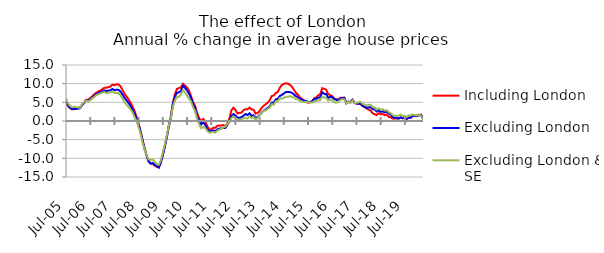
| Category | Including London | Excluding London | Excluding London & SE |
|---|---|---|---|
| 2005-07-01 | 5.042 | 5.34 | 6.041 |
| 2005-08-01 | 4.021 | 4.233 | 4.729 |
| 2005-09-01 | 3.44 | 3.609 | 4.031 |
| 2005-10-01 | 3.117 | 3.198 | 3.683 |
| 2005-11-01 | 3.119 | 3.179 | 3.804 |
| 2005-12-01 | 3.391 | 3.293 | 3.72 |
| 2006-01-01 | 3.46 | 3.314 | 3.632 |
| 2006-02-01 | 3.679 | 3.428 | 3.573 |
| 2006-03-01 | 4.36 | 4.288 | 4.578 |
| 2006-04-01 | 4.971 | 4.807 | 4.982 |
| 2006-05-01 | 5.703 | 5.549 | 5.472 |
| 2006-06-01 | 5.682 | 5.378 | 5.289 |
| 2006-07-01 | 6.13 | 5.818 | 5.553 |
| 2006-08-01 | 6.584 | 6.212 | 6.08 |
| 2006-09-01 | 7.141 | 6.725 | 6.422 |
| 2006-10-01 | 7.569 | 7.227 | 6.924 |
| 2006-11-01 | 7.9 | 7.477 | 7.14 |
| 2006-12-01 | 8.141 | 7.684 | 7.41 |
| 2007-01-01 | 8.527 | 7.906 | 7.62 |
| 2007-02-01 | 8.881 | 8.173 | 7.77 |
| 2007-03-01 | 8.911 | 8.019 | 7.457 |
| 2007-04-01 | 9.095 | 8.169 | 7.568 |
| 2007-05-01 | 9.213 | 8.204 | 7.716 |
| 2007-06-01 | 9.739 | 8.578 | 7.871 |
| 2007-07-01 | 9.603 | 8.264 | 7.598 |
| 2007-08-01 | 9.834 | 8.384 | 7.471 |
| 2007-09-01 | 9.759 | 8.353 | 7.476 |
| 2007-10-01 | 9.31 | 7.908 | 6.946 |
| 2007-11-01 | 8.338 | 7.116 | 6.089 |
| 2007-12-01 | 7.301 | 6.209 | 5.13 |
| 2008-01-01 | 6.594 | 5.569 | 4.358 |
| 2008-02-01 | 5.803 | 4.819 | 3.807 |
| 2008-03-01 | 4.897 | 4.031 | 3.135 |
| 2008-04-01 | 3.869 | 3.081 | 2.34 |
| 2008-05-01 | 2.669 | 1.982 | 1.042 |
| 2008-06-01 | 1.104 | 0.608 | -0.088 |
| 2008-07-01 | -0.68 | -0.992 | -1.674 |
| 2008-08-01 | -2.784 | -3 | -3.489 |
| 2008-09-01 | -5.142 | -5.294 | -5.824 |
| 2008-10-01 | -7.4 | -7.555 | -7.844 |
| 2008-11-01 | -9.283 | -9.376 | -9.246 |
| 2008-12-01 | -10.716 | -10.891 | -10.295 |
| 2009-01-01 | -11.416 | -11.431 | -10.399 |
| 2009-02-01 | -11.461 | -11.235 | -10.34 |
| 2009-03-01 | -11.986 | -11.748 | -10.864 |
| 2009-04-01 | -12.284 | -12.069 | -11.542 |
| 2009-05-01 | -12.391 | -12.497 | -11.751 |
| 2009-06-01 | -11.045 | -11.133 | -10.506 |
| 2009-07-01 | -9.035 | -9.204 | -8.454 |
| 2009-08-01 | -6.756 | -6.883 | -6.256 |
| 2009-09-01 | -3.959 | -4.358 | -3.813 |
| 2009-10-01 | -1.05 | -1.44 | -1.209 |
| 2009-11-01 | 1.332 | 0.762 | 0.706 |
| 2009-12-01 | 4.938 | 4.524 | 3.867 |
| 2010-01-01 | 7.185 | 6.538 | 5.474 |
| 2010-02-01 | 8.595 | 7.568 | 6.419 |
| 2010-03-01 | 8.825 | 7.698 | 6.489 |
| 2010-04-01 | 9.037 | 8.044 | 7.15 |
| 2010-05-01 | 9.954 | 9.479 | 8.277 |
| 2010-06-01 | 9.51 | 8.83 | 7.67 |
| 2010-07-01 | 8.98 | 8.233 | 6.814 |
| 2010-08-01 | 8.1 | 7.247 | 5.995 |
| 2010-09-01 | 6.68 | 6.17 | 5.224 |
| 2010-10-01 | 5.06 | 4.477 | 3.72 |
| 2010-11-01 | 4.111 | 3.455 | 2.686 |
| 2010-12-01 | 2.111 | 1.245 | 0.589 |
| 2011-01-01 | 0.812 | 0.009 | -0.813 |
| 2011-02-01 | -0.153 | -0.975 | -1.959 |
| 2011-03-01 | 0.561 | -0.352 | -1.604 |
| 2011-04-01 | -0.049 | -0.993 | -1.861 |
| 2011-05-01 | -1.337 | -2.104 | -2.603 |
| 2011-06-01 | -2.364 | -2.804 | -3.111 |
| 2011-07-01 | -2.193 | -2.71 | -3.015 |
| 2011-08-01 | -1.838 | -2.514 | -2.939 |
| 2011-09-01 | -1.815 | -2.702 | -3.127 |
| 2011-10-01 | -1.313 | -2.26 | -2.601 |
| 2011-11-01 | -1.193 | -2.051 | -2.33 |
| 2011-12-01 | -1.187 | -1.975 | -2.083 |
| 2012-01-01 | -1.1 | -1.808 | -1.74 |
| 2012-02-01 | -1.426 | -1.872 | -1.49 |
| 2012-03-01 | -0.66 | -1.074 | -0.763 |
| 2012-04-01 | 0.645 | -0.139 | -0.379 |
| 2012-05-01 | 2.851 | 1.385 | 0.785 |
| 2012-06-01 | 3.556 | 1.855 | 1.213 |
| 2012-07-01 | 2.98 | 1.48 | 0.842 |
| 2012-08-01 | 2.051 | 0.876 | 0.424 |
| 2012-09-01 | 2.183 | 0.85 | 0.325 |
| 2012-10-01 | 2.249 | 1.007 | 0.526 |
| 2012-11-01 | 2.896 | 1.405 | 0.672 |
| 2012-12-01 | 3.177 | 1.864 | 0.816 |
| 2013-01-01 | 3.149 | 1.614 | 0.648 |
| 2013-02-01 | 3.602 | 2.058 | 1.223 |
| 2013-03-01 | 3.097 | 1.383 | 0.768 |
| 2013-04-01 | 3.012 | 1.539 | 1.119 |
| 2013-05-01 | 1.998 | 0.817 | 0.37 |
| 2013-06-01 | 2.165 | 1.096 | 0.849 |
| 2013-07-01 | 2.664 | 1.622 | 1.488 |
| 2013-08-01 | 3.537 | 2.231 | 2.192 |
| 2013-09-01 | 4.062 | 2.809 | 2.824 |
| 2013-10-01 | 4.504 | 3.05 | 2.769 |
| 2013-11-01 | 4.904 | 3.489 | 3.256 |
| 2013-12-01 | 5.552 | 3.894 | 3.532 |
| 2014-01-01 | 6.672 | 4.881 | 4.507 |
| 2014-02-01 | 6.837 | 4.965 | 4.315 |
| 2014-03-01 | 7.485 | 5.784 | 5.271 |
| 2014-04-01 | 7.762 | 5.942 | 5.327 |
| 2014-05-01 | 8.89 | 6.699 | 6.153 |
| 2014-06-01 | 9.637 | 6.984 | 5.954 |
| 2014-07-01 | 9.951 | 7.361 | 6.199 |
| 2014-08-01 | 10.096 | 7.756 | 6.47 |
| 2014-09-01 | 10.007 | 7.805 | 6.464 |
| 2014-10-01 | 9.695 | 7.747 | 6.671 |
| 2014-11-01 | 9.213 | 7.531 | 6.418 |
| 2014-12-01 | 8.373 | 7.095 | 6.34 |
| 2015-01-01 | 7.547 | 6.647 | 5.856 |
| 2015-02-01 | 7.027 | 6.342 | 5.823 |
| 2015-03-01 | 6.305 | 5.908 | 5.404 |
| 2015-04-01 | 5.966 | 5.669 | 5.238 |
| 2015-05-01 | 5.412 | 5.482 | 5.073 |
| 2015-06-01 | 5.095 | 5.374 | 5.149 |
| 2015-07-01 | 4.873 | 5.112 | 5.019 |
| 2015-08-01 | 5.068 | 5.03 | 4.93 |
| 2015-09-01 | 5.314 | 5.251 | 4.922 |
| 2015-10-01 | 6.053 | 5.827 | 5.238 |
| 2015-11-01 | 6.264 | 5.939 | 5.358 |
| 2015-12-01 | 6.887 | 6.247 | 5.55 |
| 2016-01-01 | 7.107 | 6.314 | 5.615 |
| 2016-02-01 | 8.779 | 7.698 | 6.563 |
| 2016-03-01 | 8.635 | 7.291 | 6.253 |
| 2016-04-01 | 8.371 | 7.184 | 6.224 |
| 2016-05-01 | 7.156 | 6.181 | 5.489 |
| 2016-06-01 | 6.972 | 6.52 | 5.778 |
| 2016-07-01 | 6.659 | 6.355 | 5.535 |
| 2016-08-01 | 5.976 | 5.937 | 5.005 |
| 2016-09-01 | 5.835 | 5.644 | 4.902 |
| 2016-10-01 | 5.753 | 5.566 | 5.12 |
| 2016-11-01 | 6.201 | 5.946 | 5.677 |
| 2016-12-01 | 6.209 | 6.09 | 5.808 |
| 2017-01-01 | 6.212 | 6.218 | 5.846 |
| 2017-02-01 | 4.709 | 4.856 | 4.729 |
| 2017-03-01 | 5.087 | 5.218 | 5.135 |
| 2017-04-01 | 5.037 | 4.991 | 4.884 |
| 2017-05-01 | 5.713 | 5.63 | 5.481 |
| 2017-06-01 | 4.922 | 4.802 | 4.805 |
| 2017-07-01 | 4.694 | 4.681 | 4.875 |
| 2017-08-01 | 4.548 | 4.66 | 4.997 |
| 2017-09-01 | 4.546 | 4.661 | 5.149 |
| 2017-10-01 | 4.045 | 4.097 | 4.617 |
| 2017-11-01 | 3.801 | 3.778 | 4.397 |
| 2017-12-01 | 3.345 | 3.572 | 4.193 |
| 2018-01-01 | 3.076 | 3.616 | 4.283 |
| 2018-02-01 | 2.85 | 3.709 | 4.383 |
| 2018-03-01 | 2.045 | 3.175 | 3.754 |
| 2018-04-01 | 1.853 | 3.127 | 3.645 |
| 2018-05-01 | 1.563 | 2.563 | 3.05 |
| 2018-06-01 | 2.107 | 2.876 | 3.381 |
| 2018-07-01 | 1.779 | 2.45 | 3.027 |
| 2018-08-01 | 1.905 | 2.582 | 3.154 |
| 2018-09-01 | 1.567 | 2.333 | 2.802 |
| 2018-10-01 | 1.769 | 2.521 | 2.902 |
| 2018-11-01 | 1.108 | 2.039 | 2.339 |
| 2018-12-01 | 0.984 | 1.673 | 2.129 |
| 2019-01-01 | 0.629 | 1.086 | 1.548 |
| 2019-02-01 | 0.686 | 0.875 | 1.395 |
| 2019-03-01 | 0.686 | 0.774 | 1.352 |
| 2019-04-01 | 0.702 | 0.679 | 1.469 |
| 2019-05-01 | 0.978 | 0.947 | 1.724 |
| 2019-06-01 | 0.765 | 0.705 | 1.266 |
| 2019-07-01 | 0.894 | 0.933 | 1.384 |
| 2019-08-01 | 0.578 | 0.627 | 1.092 |
| 2019-09-01 | 0.851 | 0.938 | 1.551 |
| 2019-10-01 | 0.847 | 0.944 | 1.469 |
| 2019-11-01 | 1.476 | 1.421 | 1.779 |
| 2019-12-01 | 1.447 | 1.336 | 1.527 |
| 2020-01-01 | 1.514 | 1.293 | 1.492 |
| 2020-02-01 | 1.652 | 1.568 | 1.75 |
| 2020-03-01 | 1.674 | 1.522 | 1.325 |
| 2020-04-01 | 0.717 | 0.817 | 0.315 |